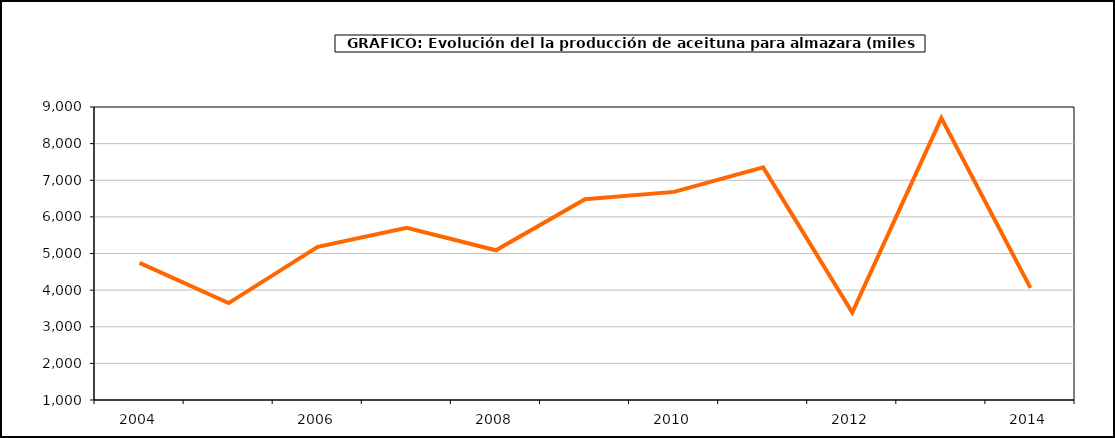
| Category | producción |
|---|---|
| 2004.0 | 4744.637 |
| 2005.0 | 3646.301 |
| 2006.0 | 5183.035 |
| 2007.0 | 5701.679 |
| 2008.0 | 5088.942 |
| 2009.0 | 6482.726 |
| 2010.0 | 6682.009 |
| 2011.0 | 7352.697 |
| 2012.0 | 3387.3 |
| 2013.0 | 8695.861 |
| 2014.0 | 4060.978 |